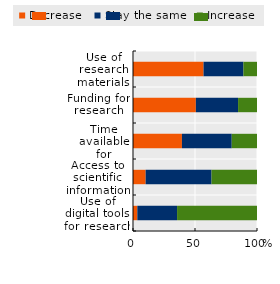
| Category | Decrease | Stay the same | Increase |
|---|---|---|---|
| Use of digital tools for research | 3.49 | 32.051 | 64.459 |
| Access to scientific information and data | 10.213 | 53.121 | 36.667 |
| Time available for research | 39.457 | 40.172 | 20.372 |
| Funding for research | 50.69 | 34.049 | 15.261 |
| Use of research materials and facilities | 56.893 | 32.166 | 10.941 |